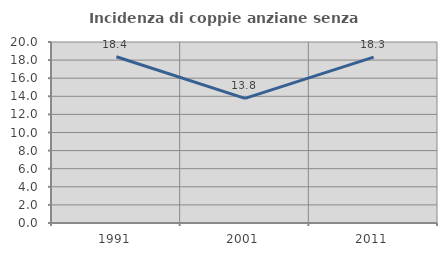
| Category | Incidenza di coppie anziane senza figli  |
|---|---|
| 1991.0 | 18.367 |
| 2001.0 | 13.768 |
| 2011.0 | 18.333 |